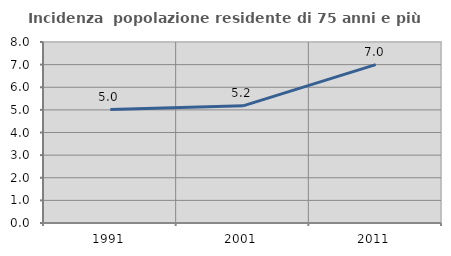
| Category | Incidenza  popolazione residente di 75 anni e più |
|---|---|
| 1991.0 | 5.016 |
| 2001.0 | 5.179 |
| 2011.0 | 7.002 |